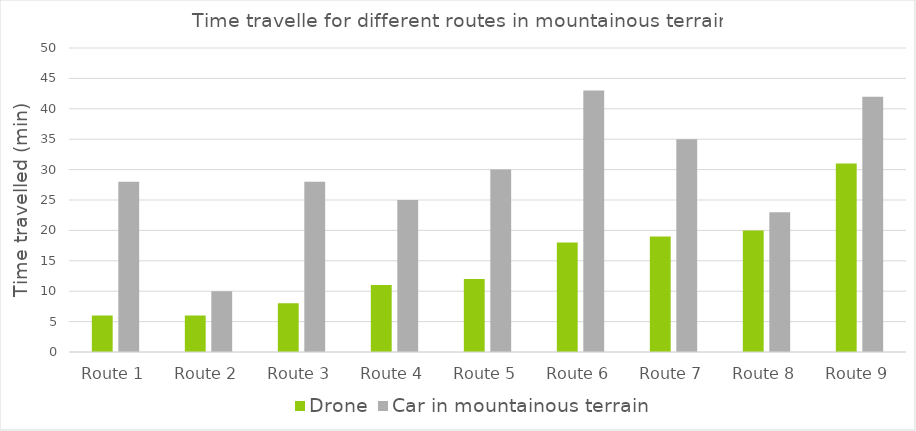
| Category | Drone | Car in mountainous terrain |
|---|---|---|
| Route 1 | 6 | 28 |
| Route 2 | 6 | 10 |
| Route 3 | 8 | 28 |
| Route 4 | 11 | 25 |
| Route 5 | 12 | 30 |
| Route 6 | 18 | 43 |
| Route 7 | 19 | 35 |
| Route 8 | 20 | 23 |
| Route 9 | 31 | 42 |